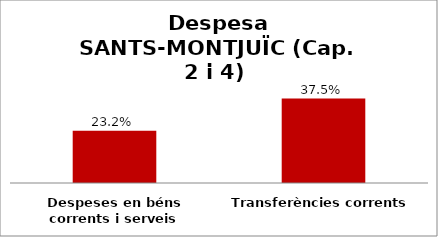
| Category | Series 0 |
|---|---|
| Despeses en béns corrents i serveis | 0.232 |
| Transferències corrents | 0.375 |